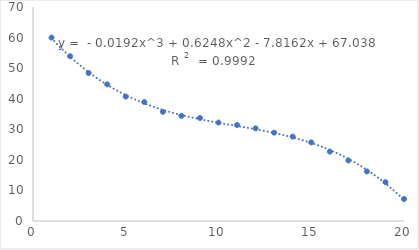
| Category | Series 0 |
|---|---|
| 1.0 | 60 |
| 2.0 | 53.9 |
| 3.0 | 48.4 |
| 4.0 | 44.7 |
| 5.0 | 40.7 |
| 6.0 | 38.9 |
| 7.0 | 35.7 |
| 8.0 | 34.4 |
| 9.0 | 33.7 |
| 10.0 | 32.2 |
| 11.0 | 31.4 |
| 12.0 | 30.3 |
| 13.0 | 28.9 |
| 14.0 | 27.6 |
| 15.0 | 25.7 |
| 16.0 | 22.7 |
| 17.0 | 19.8 |
| 18.0 | 16.2 |
| 19.0 | 12.7 |
| 20.0 | 7.2 |